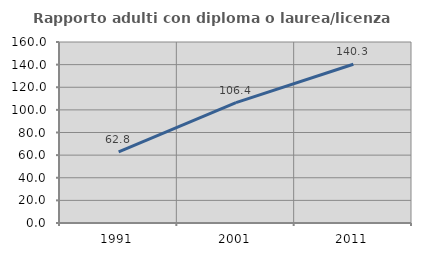
| Category | Rapporto adulti con diploma o laurea/licenza media  |
|---|---|
| 1991.0 | 62.791 |
| 2001.0 | 106.376 |
| 2011.0 | 140.299 |